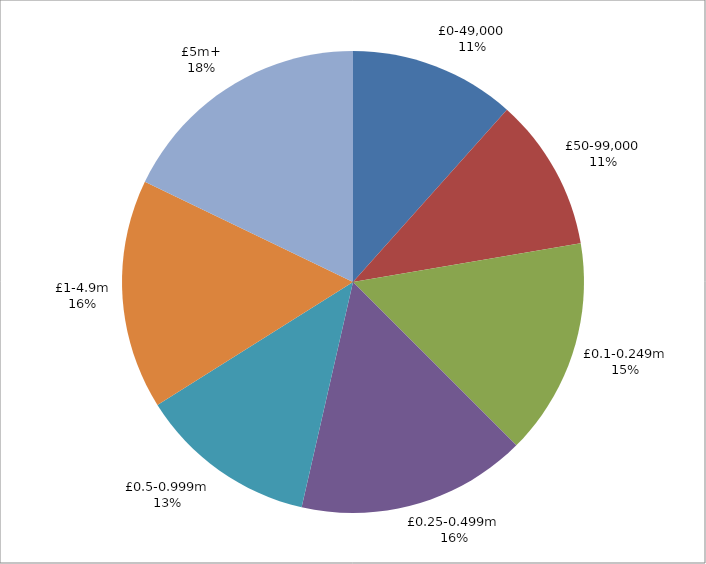
| Category | Series 0 |
|---|---|
| £0-49,000 | 13 |
| £50-99,000 | 12 |
| £0.1-0.249m | 17 |
| £0.25-0.499m | 18 |
| £0.5-0.999m | 14 |
| £1-4.9m | 18 |
| £5m+ | 20 |